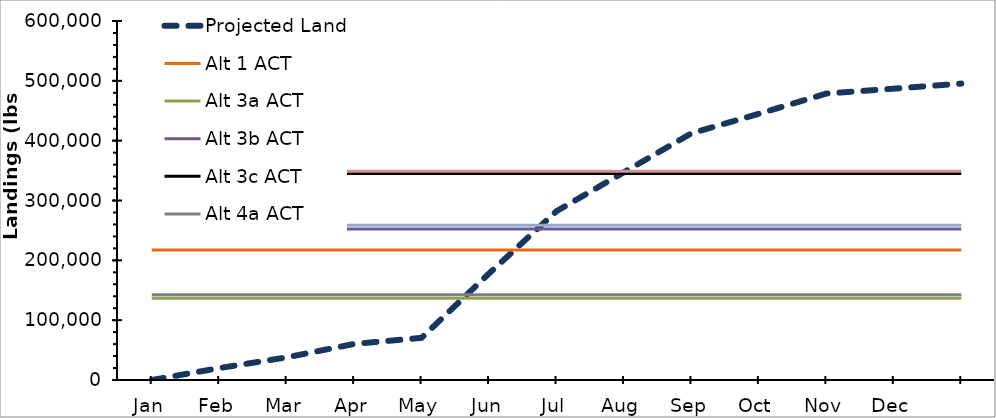
| Category | Projected Landings | Alt 1 ACT | Alt 3a ACT | Alt 3b ACT | Alt 3c ACT | Alt 4a ACT | Alt 4b ACT | Alt 4c ACT |
|---|---|---|---|---|---|---|---|---|
| Jan | 0 | 217100 | 136500 | 252200 | 345100 | 142400 | 258700 | 348700 |
| Feb | 19870.949 | 217100 | 136500 | 252200 | 345100 | 142400 | 258700 | 348700 |
| Mar | 37818.903 | 217100 | 136500 | 252200 | 345100 | 142400 | 258700 | 348700 |
| Apr | 60286.705 | 217100 | 136500 | 252200 | 345100 | 142400 | 258700 | 348700 |
| May | 70433.454 | 217100 | 136500 | 252200 | 345100 | 142400 | 258700 | 348700 |
| Jun | 178029.915 | 217100 | 136500 | 252200 | 345100 | 142400 | 258700 | 348700 |
| Jul | 282155.523 | 217100 | 136500 | 252200 | 345100 | 142400 | 258700 | 348700 |
| Aug | 347231.244 | 217100 | 136500 | 252200 | 345100 | 142400 | 258700 | 348700 |
| Sep | 412306.966 | 217100 | 136500 | 252200 | 345100 | 142400 | 258700 | 348700 |
| Oct | 444965.274 | 217100 | 136500 | 252200 | 345100 | 142400 | 258700 | 348700 |
| Nov | 478712.191 | 217100 | 136500 | 252200 | 345100 | 142400 | 258700 | 348700 |
| Dec | 486923.358 | 217100 | 136500 | 252200 | 345100 | 142400 | 258700 | 348700 |